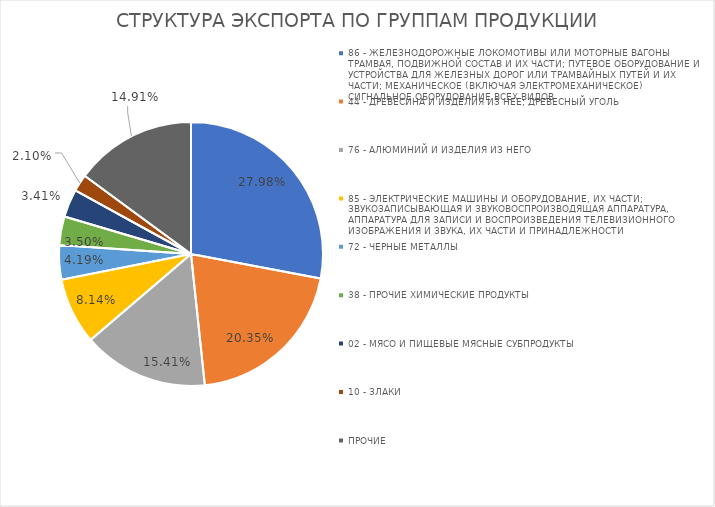
| Category | Series 0 |
|---|---|
| 86 - ЖЕЛЕЗНОДОРОЖНЫЕ ЛОКОМОТИВЫ ИЛИ МОТОРНЫЕ ВАГОНЫ ТРАМВАЯ, ПОДВИЖНОЙ СОСТАВ И ИХ ЧАСТИ; ПУТЕВОЕ ОБОРУДОВАНИЕ И УСТРОЙСТВА ДЛЯ ЖЕЛЕЗНЫХ ДОРОГ ИЛИ ТРАМВАЙНЫХ ПУТЕЙ И ИХ ЧАСТИ; МЕХАНИЧЕСКОЕ (ВКЛЮЧАЯ ЭЛЕКТРОМЕХАНИЧЕСКОЕ) СИГНАЛЬНОЕ ОБОРУДОВАНИЕ ВСЕХ ВИДОВ | 0.28 |
| 44 - ДРЕВЕСИНА И ИЗДЕЛИЯ ИЗ НЕЕ; ДРЕВЕСНЫЙ УГОЛЬ | 0.203 |
| 76 - АЛЮМИНИЙ И ИЗДЕЛИЯ ИЗ НЕГО | 0.154 |
| 85 - ЭЛЕКТРИЧЕСКИЕ МАШИНЫ И ОБОРУДОВАНИЕ, ИХ ЧАСТИ; ЗВУКОЗАПИСЫВАЮЩАЯ И ЗВУКОВОСПРОИЗВОДЯЩАЯ АППАРАТУРА, АППАРАТУРА ДЛЯ ЗАПИСИ И ВОСПРОИЗВЕДЕНИЯ ТЕЛЕВИЗИОННОГО ИЗОБРАЖЕНИЯ И ЗВУКА, ИХ ЧАСТИ И ПРИНАДЛЕЖНОСТИ | 0.081 |
| 72 - ЧЕРНЫЕ МЕТАЛЛЫ | 0.042 |
| 38 - ПРОЧИЕ ХИМИЧЕСКИЕ ПРОДУКТЫ | 0.035 |
| 02 - МЯСО И ПИЩЕВЫЕ МЯСНЫЕ СУБПРОДУКТЫ | 0.034 |
| 10 - ЗЛАКИ | 0.021 |
| ПРОЧИЕ | 0.149 |